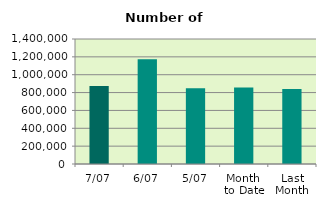
| Category | Series 0 |
|---|---|
| 7/07 | 872922 |
| 6/07 | 1172632 |
| 5/07 | 848718 |
| Month 
to Date | 856854.4 |
| Last
Month | 840506.364 |